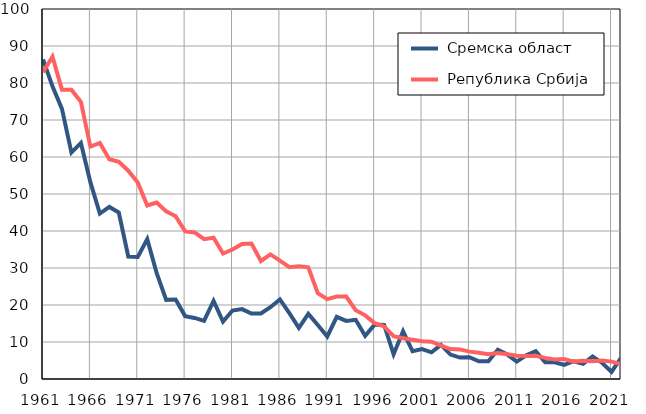
| Category |  Сремска област |  Република Србија |
|---|---|---|
| 1961.0 | 86.4 | 82.9 |
| 1962.0 | 79.1 | 87.1 |
| 1963.0 | 73 | 78.2 |
| 1964.0 | 61.2 | 78.2 |
| 1965.0 | 63.8 | 74.9 |
| 1966.0 | 53.2 | 62.8 |
| 1967.0 | 44.7 | 63.8 |
| 1968.0 | 46.5 | 59.4 |
| 1969.0 | 45 | 58.7 |
| 1970.0 | 33.1 | 56.3 |
| 1971.0 | 33 | 53.1 |
| 1972.0 | 37.8 | 46.9 |
| 1973.0 | 28.6 | 47.7 |
| 1974.0 | 21.4 | 45.3 |
| 1975.0 | 21.5 | 44 |
| 1976.0 | 17 | 39.9 |
| 1977.0 | 16.5 | 39.6 |
| 1978.0 | 15.7 | 37.8 |
| 1979.0 | 21.1 | 38.2 |
| 1980.0 | 15.5 | 33.9 |
| 1981.0 | 18.5 | 35 |
| 1982.0 | 18.9 | 36.5 |
| 1983.0 | 17.7 | 36.6 |
| 1984.0 | 17.7 | 31.9 |
| 1985.0 | 19.4 | 33.7 |
| 1986.0 | 21.5 | 32 |
| 1987.0 | 17.8 | 30.2 |
| 1988.0 | 13.8 | 30.5 |
| 1989.0 | 17.6 | 30.2 |
| 1990.0 | 14.6 | 23.2 |
| 1991.0 | 11.5 | 21.6 |
| 1992.0 | 16.8 | 22.3 |
| 1993.0 | 15.7 | 22.3 |
| 1994.0 | 16 | 18.6 |
| 1995.0 | 11.7 | 17.2 |
| 1996.0 | 14.7 | 15.1 |
| 1997.0 | 14.6 | 14.2 |
| 1998.0 | 6.7 | 11.6 |
| 1999.0 | 12.9 | 11 |
| 2000.0 | 7.5 | 10.6 |
| 2001.0 | 8.1 | 10.2 |
| 2002.0 | 7.2 | 10.1 |
| 2003.0 | 9.2 | 9 |
| 2004.0 | 6.6 | 8.1 |
| 2005.0 | 5.8 | 8 |
| 2006.0 | 5.9 | 7.4 |
| 2007.0 | 4.8 | 7.1 |
| 2008.0 | 4.8 | 6.7 |
| 2009.0 | 7.9 | 7 |
| 2010.0 | 6.6 | 6.7 |
| 2011.0 | 4.7 | 6.3 |
| 2012.0 | 6.4 | 6.2 |
| 2013.0 | 7.5 | 6.3 |
| 2014.0 | 4.5 | 5.7 |
| 2015.0 | 4.5 | 5.3 |
| 2016.0 | 3.8 | 5.4 |
| 2017.0 | 4.8 | 4.7 |
| 2018.0 | 4.1 | 4.9 |
| 2019.0 | 6.1 | 4.8 |
| 2020.0 | 4.4 | 5 |
| 2021.0 | 1.9 | 4.7 |
| 2022.0 | 5.7 | 4 |